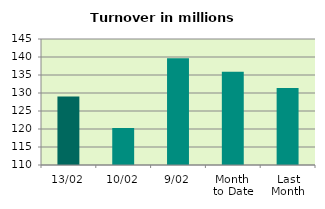
| Category | Series 0 |
|---|---|
| 13/02 | 129.058 |
| 10/02 | 120.284 |
| 9/02 | 139.655 |
| Month 
to Date | 135.884 |
| Last
Month | 131.402 |